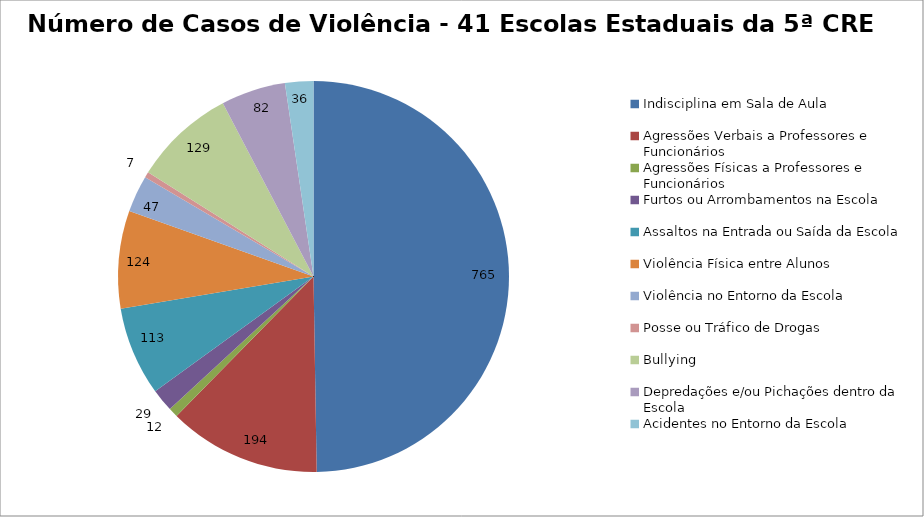
| Category | Número de Casos |
|---|---|
| Indisciplina em Sala de Aula | 765 |
| Agressões Verbais a Professores e Funcionários | 194 |
| Agressões Físicas a Professores e Funcionários | 12 |
| Furtos ou Arrombamentos na Escola | 29 |
| Assaltos na Entrada ou Saída da Escola | 113 |
| Violência Física entre Alunos | 124 |
| Violência no Entorno da Escola | 47 |
| Posse ou Tráfico de Drogas | 7 |
| Bullying | 129 |
| Depredações e/ou Pichações dentro da Escola | 82 |
| Acidentes no Entorno da Escola | 36 |